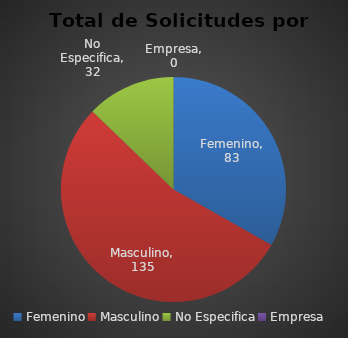
| Category | Series 0 |
|---|---|
| Femenino | 83 |
| Masculino | 135 |
| No Especifica | 32 |
| Empresa | 0 |